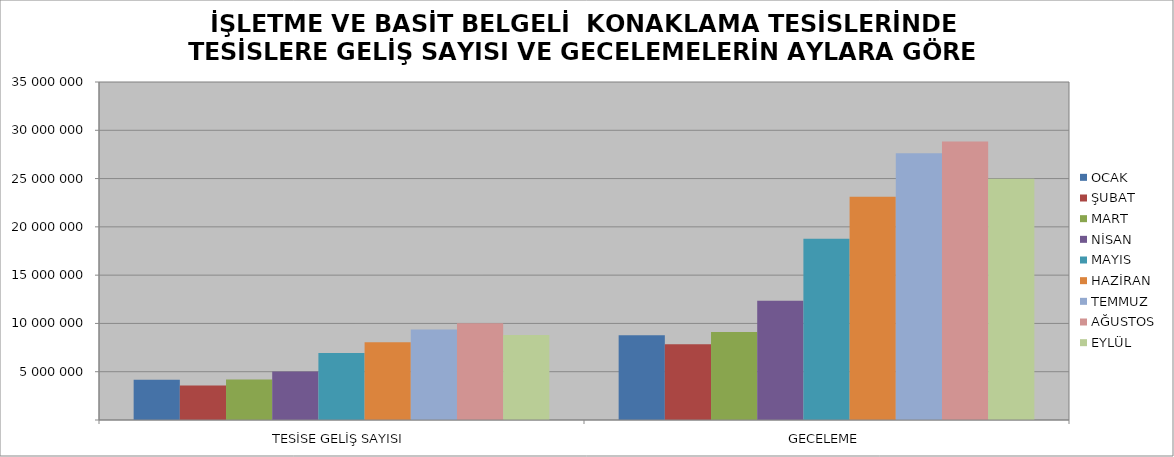
| Category | OCAK | ŞUBAT | MART | NİSAN | MAYIS | HAZİRAN | TEMMUZ | AĞUSTOS | EYLÜL |
|---|---|---|---|---|---|---|---|---|---|
| TESİSE GELİŞ SAYISI | 4176369 | 3577989 | 4200030 | 5022587 | 6927000 | 8050681 | 9379348 | 10028953 | 8800056 |
| GECELEME | 8783046 | 7837722 | 9122802 | 12360237 | 18778808 | 23106038 | 27617279 | 28851182 | 24974127 |